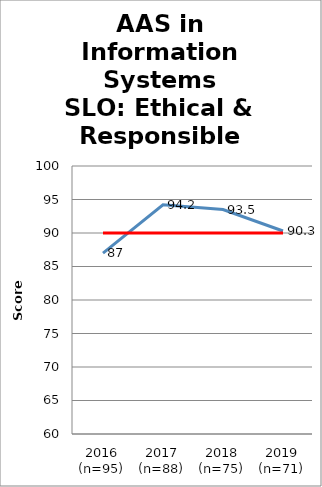
| Category | Series 0 | Series 1 |
|---|---|---|
| 2016 (n=95) | 87 | 90 |
| 2017 (n=88) | 94.2 | 90 |
| 2018 (n=75) | 93.5 | 90 |
| 2019 (n=71) | 90.3 | 90 |